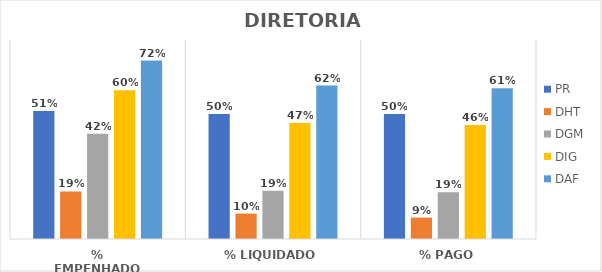
| Category | PR | DHT | DGM | DIG | DAF |
|---|---|---|---|---|---|
| % EMPENHADO | 0.515 | 0.191 | 0.423 | 0.598 | 0.717 |
| % LIQUIDADO | 0.503 | 0.102 | 0.194 | 0.467 | 0.617 |
| % PAGO | 0.503 | 0.086 | 0.188 | 0.459 | 0.606 |